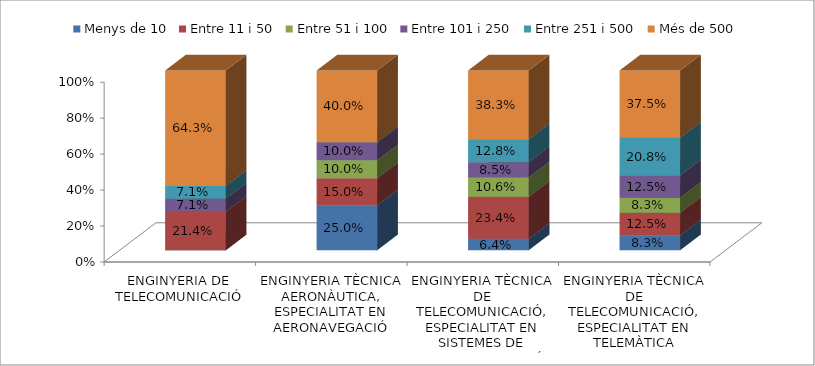
| Category | Menys de 10 | Entre 11 i 50 | Entre 51 i 100 | Entre 101 i 250 | Entre 251 i 500 | Més de 500 |
|---|---|---|---|---|---|---|
| ENGINYERIA DE TELECOMUNICACIÓ | 0 | 0.214 | 0 | 0.071 | 0.071 | 0.643 |
| ENGINYERIA TÈCNICA AERONÀUTICA, ESPECIALITAT EN AERONAVEGACIÓ | 0.25 | 0.15 | 0.1 | 0.1 | 0 | 0.4 |
| ENGINYERIA TÈCNICA DE TELECOMUNICACIÓ, ESPECIALITAT EN SISTEMES DE TELECOMUNICACIÓ | 0.064 | 0.234 | 0.106 | 0.085 | 0.128 | 0.383 |
| ENGINYERIA TÈCNICA DE TELECOMUNICACIÓ, ESPECIALITAT EN TELEMÀTICA | 0.083 | 0.125 | 0.083 | 0.125 | 0.208 | 0.375 |